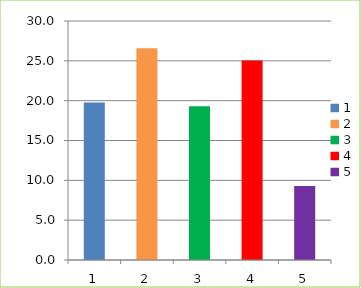
| Category | Series 0 |
|---|---|
| 0 | 19.782 |
| 1 | 26.589 |
| 2 | 19.298 |
| 3 | 25.057 |
| 4 | 9.275 |